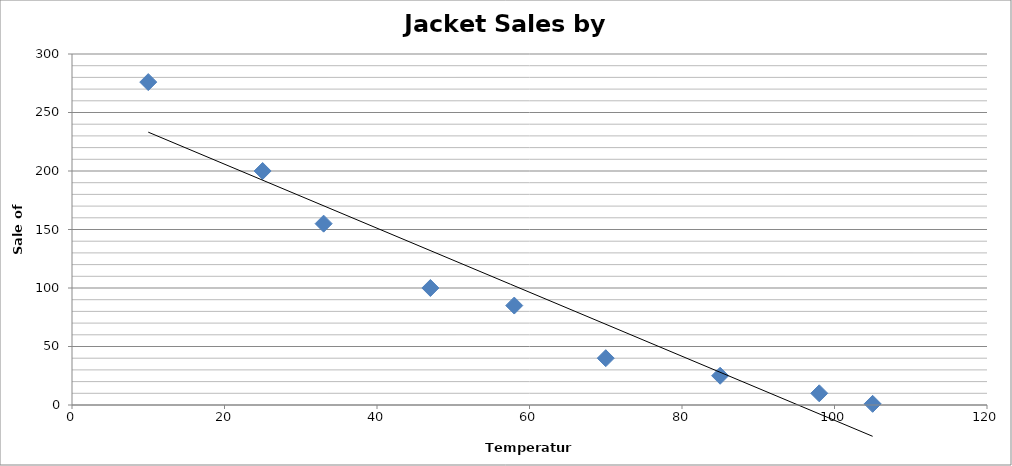
| Category | Sale of Jackets |
|---|---|
| 10.0 | 276 |
| 25.0 | 200 |
| 33.0 | 155 |
| 47.0 | 100 |
| 58.0 | 85 |
| 70.0 | 40 |
| 85.0 | 25 |
| 98.0 | 10 |
| 105.0 | 1 |